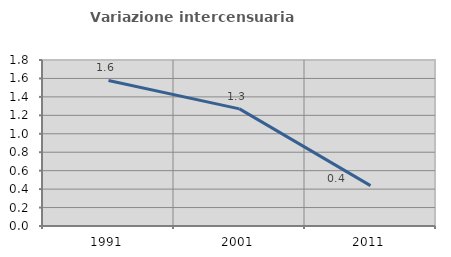
| Category | Variazione intercensuaria annua |
|---|---|
| 1991.0 | 1.578 |
| 2001.0 | 1.27 |
| 2011.0 | 0.438 |